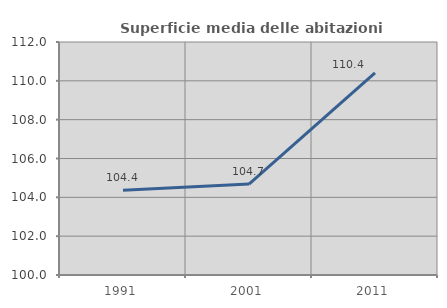
| Category | Superficie media delle abitazioni occupate |
|---|---|
| 1991.0 | 104.364 |
| 2001.0 | 104.684 |
| 2011.0 | 110.414 |